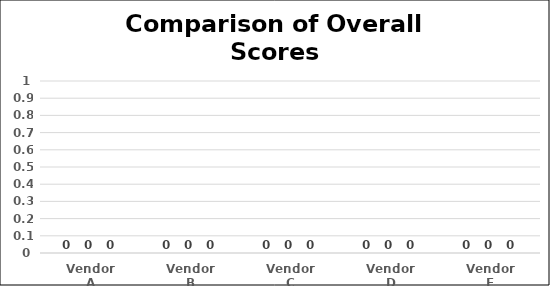
| Category | Series 0 | Series 1 | Series 2 |
|---|---|---|---|
| Vendor A | 0 | 0 | 0 |
| Vendor B | 0 | 0 | 0 |
| Vendor C | 0 | 0 | 0 |
| Vendor D | 0 | 0 | 0 |
| Vendor E | 0 | 0 | 0 |